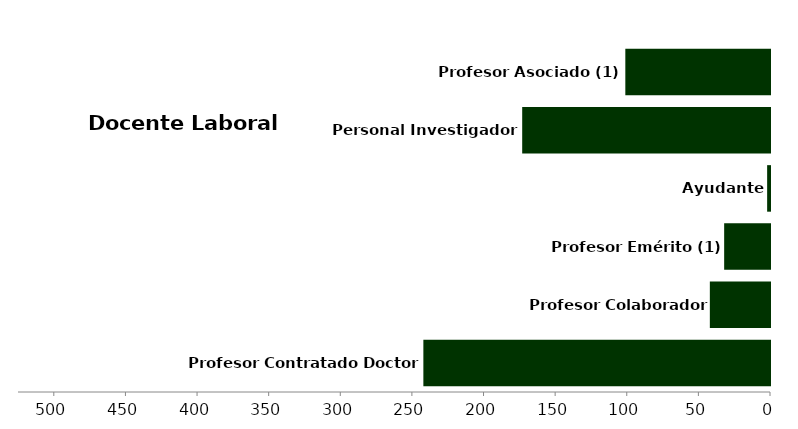
| Category | Series 3 |
|---|---|
| Profesor Contratado Doctor | 242 |
| Profesor Colaborador | 42 |
| Profesor Emérito (1) | 32 |
| Ayudante | 2 |
| Personal Investigador | 173 |
| Profesor Asociado (1) | 101 |